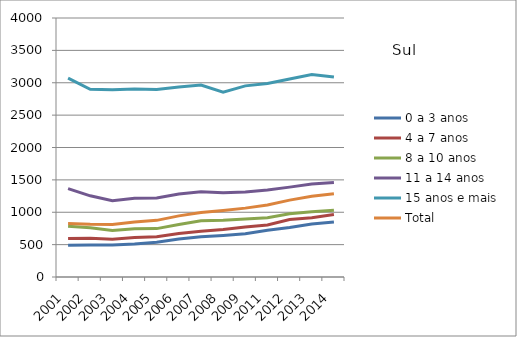
| Category | 0 a 3 anos | 4 a 7 anos | 8 a 10 anos | 11 a 14 anos | 15 anos e mais | Total |
|---|---|---|---|---|---|---|
| 2001.0 | 490.4 | 594.3 | 783.5 | 1365.7 | 3071.9 | 826.4 |
| 2002.0 | 494.7 | 597.7 | 761.9 | 1253.9 | 2899.4 | 815 |
| 2003.0 | 493.4 | 581.2 | 718 | 1178.7 | 2891.8 | 811.8 |
| 2004.0 | 509 | 608.7 | 746.4 | 1216.3 | 2902.6 | 850 |
| 2005.0 | 537.7 | 623.1 | 747.5 | 1219.6 | 2894.4 | 874.6 |
| 2006.0 | 585.2 | 672.2 | 812.1 | 1282.5 | 2934.2 | 944 |
| 2007.0 | 622.6 | 707.4 | 868.5 | 1315.4 | 2964 | 994.7 |
| 2008.0 | 642.5 | 734.3 | 877.5 | 1299.3 | 2852.6 | 1027.6 |
| 2009.0 | 669.6 | 771.2 | 897.5 | 1311.4 | 2951.8 | 1063.8 |
| 2011.0 | 721.6 | 801.9 | 914.6 | 1344.2 | 2989.1 | 1111 |
| 2012.0 | 764.4 | 886.7 | 976.9 | 1388.1 | 3058.3 | 1187.7 |
| 2013.0 | 819.8 | 916 | 1008.6 | 1437.6 | 3127.9 | 1248.6 |
| 2014.0 | 850.5 | 964.6 | 1030.7 | 1460 | 3088.4 | 1287 |